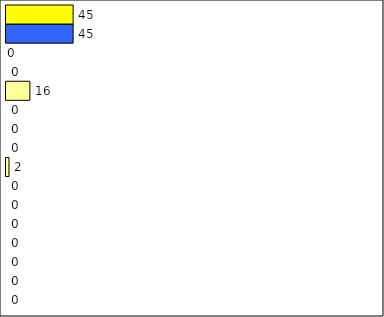
| Category | -2 | -1 | 0 | 1 | 2 | 3 | 4 | 5 | 6 | 7 | 8 | 9 | 10 | 11 | 12 | Perfect Round |
|---|---|---|---|---|---|---|---|---|---|---|---|---|---|---|---|---|
| 0 | 0 | 0 | 0 | 0 | 0 | 0 | 0 | 2 | 0 | 0 | 0 | 16 | 0 | 0 | 45 | 45 |